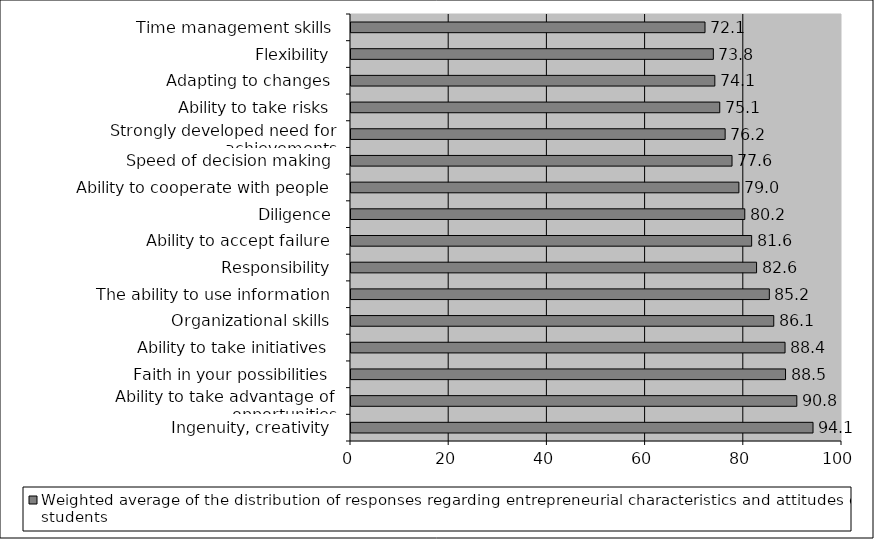
| Category | Weighted average of the distribution of responses regarding entrepreneurial characteristics and attitudes of students |
|---|---|
| Ingenuity, creativity | 94.1 |
| Ability to take advantage of opportunities | 90.8 |
| Faith in your possibilities | 88.5 |
| Ability to take initiatives | 88.4 |
| Organizational skills | 86.1 |
| The ability to use information | 85.2 |
| Responsibility | 82.6 |
| Ability to accept failure | 81.6 |
| Diligence | 80.2 |
| Ability to cooperate with people | 79 |
| Speed of decision making | 77.6 |
| Strongly developed need for achievements | 76.2 |
| Ability to take risks | 75.1 |
| Adapting to changes | 74.1 |
| Flexibility | 73.8 |
| Time management skills | 72.1 |